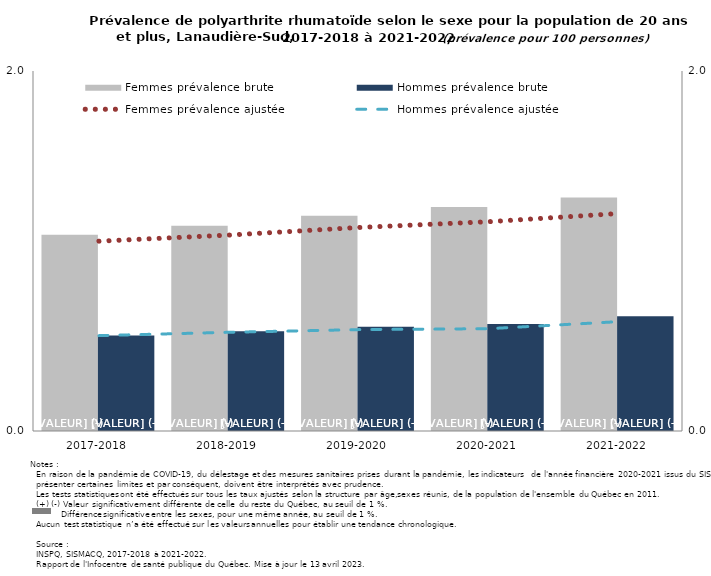
| Category | Femmes prévalence brute | Hommes prévalence brute |
|---|---|---|
| 2017-2018 | 1.09 | 0.531 |
| 2018-2019 | 1.141 | 0.554 |
| 2019-2020 | 1.196 | 0.58 |
| 2020-2021 | 1.244 | 0.595 |
| 2021-2022 | 1.298 | 0.638 |